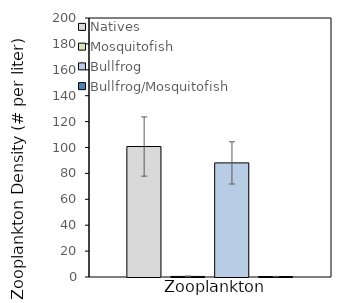
| Category | Natives | Mosquitofish | Bullfrog | Bullfrog/Mosquitofish |
|---|---|---|---|---|
| Zooplankton | 100.754 | 0.435 | 88.116 | 0.348 |